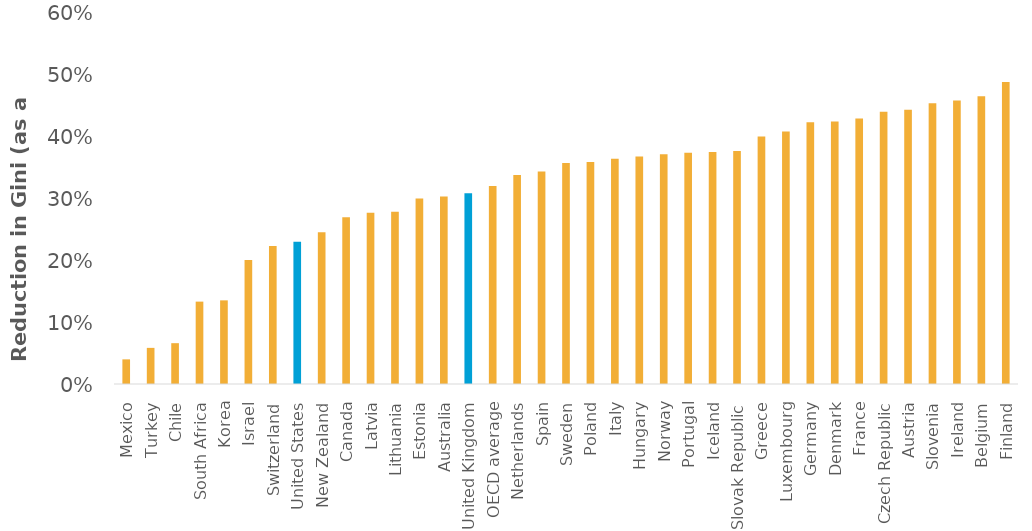
| Category | Series 0 |
|---|---|
| Mexico | 0.04 |
| Turkey | 0.058 |
| Chile | 0.066 |
| South Africa | 0.133 |
| Korea | 0.135 |
| Israel | 0.2 |
| Switzerland | 0.223 |
| United States | 0.229 |
| New Zealand | 0.245 |
| Canada | 0.269 |
| Latvia | 0.276 |
| Lithuania | 0.278 |
| Estonia | 0.299 |
| Australia | 0.302 |
| United Kingdom | 0.308 |
| OECD average | 0.319 |
| Netherlands | 0.337 |
| Spain | 0.343 |
| Sweden | 0.356 |
| Poland | 0.358 |
| Italy | 0.363 |
| Hungary | 0.367 |
| Norway | 0.37 |
| Portugal | 0.373 |
| Iceland | 0.374 |
| Slovak Republic | 0.376 |
| Greece | 0.399 |
| Luxembourg | 0.407 |
| Germany | 0.422 |
| Denmark | 0.423 |
| France | 0.428 |
| Czech Republic | 0.439 |
| Austria | 0.442 |
| Slovenia | 0.453 |
| Ireland | 0.457 |
| Belgium | 0.464 |
| Finland | 0.487 |